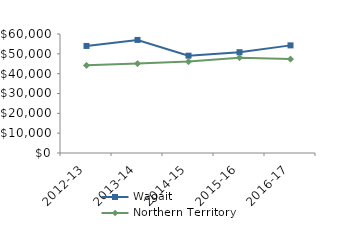
| Category | Wagait | Northern Territory |
|---|---|---|
| 2012-13 | 53978.87 | 44232.02 |
| 2013-14 | 57005.42 | 45075.51 |
| 2014-15 | 49077 | 46083.65 |
| 2015-16 | 50818 | 48046.27 |
| 2016-17 | 54263.33 | 47367.05 |